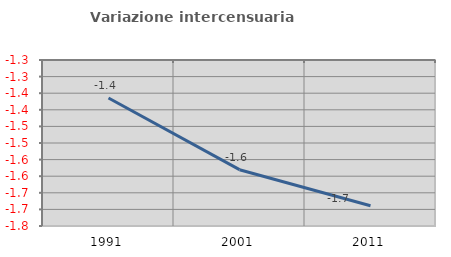
| Category | Variazione intercensuaria annua |
|---|---|
| 1991.0 | -1.364 |
| 2001.0 | -1.58 |
| 2011.0 | -1.689 |